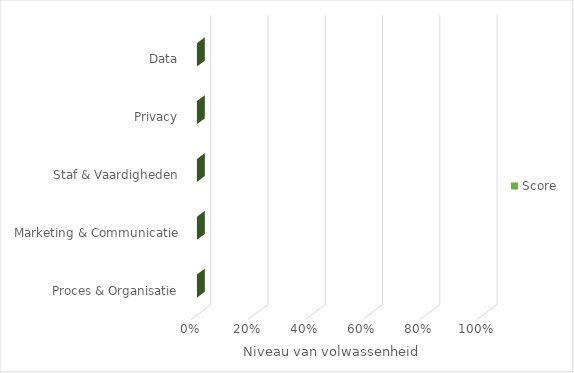
| Category | Score |
|---|---|
| Proces & Organisatie | 0 |
| Marketing & Communicatie | 0 |
| Staf & Vaardigheden | 0 |
| Privacy | 0 |
| Data | 0 |